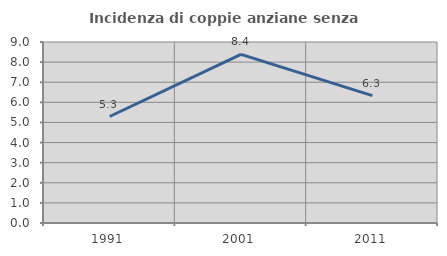
| Category | Incidenza di coppie anziane senza figli  |
|---|---|
| 1991.0 | 5.295 |
| 2001.0 | 8.383 |
| 2011.0 | 6.332 |